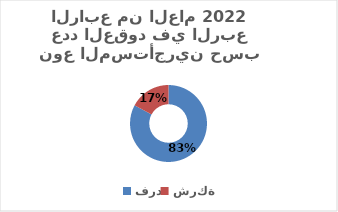
| Category | Series 0 |
|---|---|
| فرد | 0.828 |
| شركة | 0.172 |